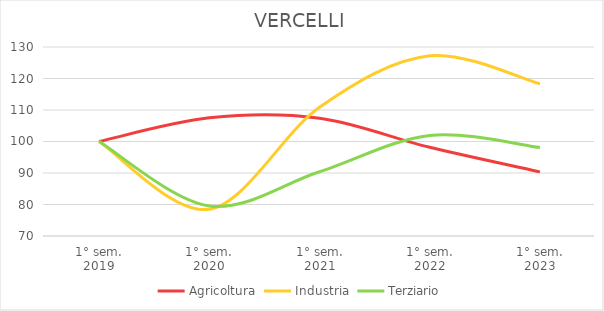
| Category | Agricoltura | Industria | Terziario |
|---|---|---|---|
| 1° sem.
2019 | 100 | 100 | 100 |
| 1° sem.
2020 | 107.507 | 78.492 | 79.552 |
| 1° sem.
2021 | 107.365 | 110.854 | 90.407 |
| 1° sem.
2022 | 98.159 | 127.215 | 101.927 |
| 1° sem.
2023 | 90.368 | 118.316 | 98.1 |